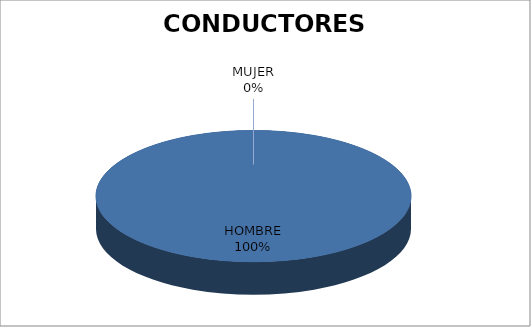
| Category | E.E. |
|---|---|
| HOMBRE | 32 |
| MUJER | 0 |